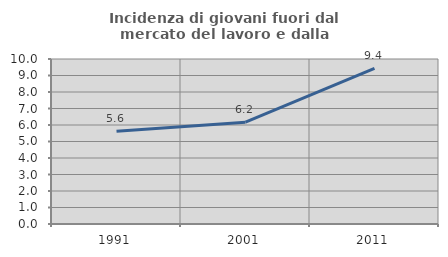
| Category | Incidenza di giovani fuori dal mercato del lavoro e dalla formazione  |
|---|---|
| 1991.0 | 5.626 |
| 2001.0 | 6.174 |
| 2011.0 | 9.438 |